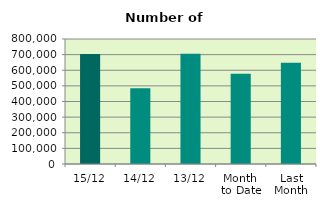
| Category | Series 0 |
|---|---|
| 15/12 | 703558 |
| 14/12 | 485294 |
| 13/12 | 705128 |
| Month 
to Date | 577832 |
| Last
Month | 647745.364 |